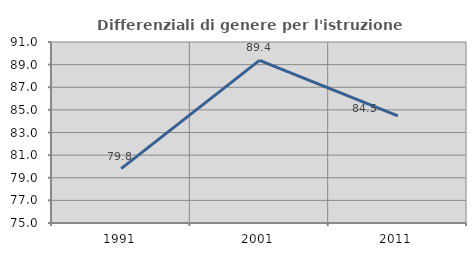
| Category | Differenziali di genere per l'istruzione superiore |
|---|---|
| 1991.0 | 79.803 |
| 2001.0 | 89.38 |
| 2011.0 | 84.477 |